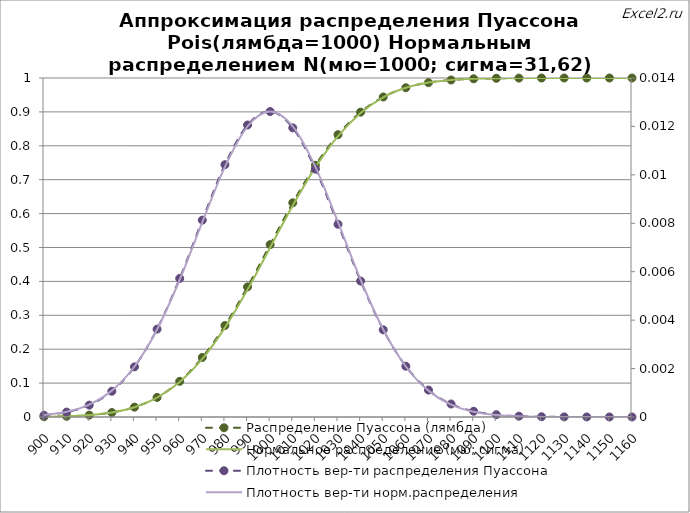
| Category | Распределение Пуассона (лямбда) | Нормальное распределение (мю; сигма) |
|---|---|---|
| 900.0 | 0.001 | 0.001 |
| 910.0 | 0.002 | 0.002 |
| 920.0 | 0.005 | 0.006 |
| 930.0 | 0.013 | 0.013 |
| 940.0 | 0.029 | 0.029 |
| 950.0 | 0.058 | 0.057 |
| 960.0 | 0.105 | 0.103 |
| 970.0 | 0.176 | 0.171 |
| 980.0 | 0.27 | 0.264 |
| 990.0 | 0.384 | 0.376 |
| 1000.0 | 0.508 | 0.5 |
| 1010.0 | 0.632 | 0.624 |
| 1020.0 | 0.743 | 0.736 |
| 1030.0 | 0.833 | 0.829 |
| 1040.0 | 0.899 | 0.897 |
| 1050.0 | 0.944 | 0.943 |
| 1060.0 | 0.971 | 0.971 |
| 1070.0 | 0.986 | 0.987 |
| 1080.0 | 0.994 | 0.994 |
| 1090.0 | 0.998 | 0.998 |
| 1100.0 | 0.999 | 0.999 |
| 1110.0 | 1 | 1 |
| 1120.0 | 1 | 1 |
| 1130.0 | 1 | 1 |
| 1140.0 | 1 | 1 |
| 1150.0 | 1 | 1 |
| 1160.0 | 1 | 1 |